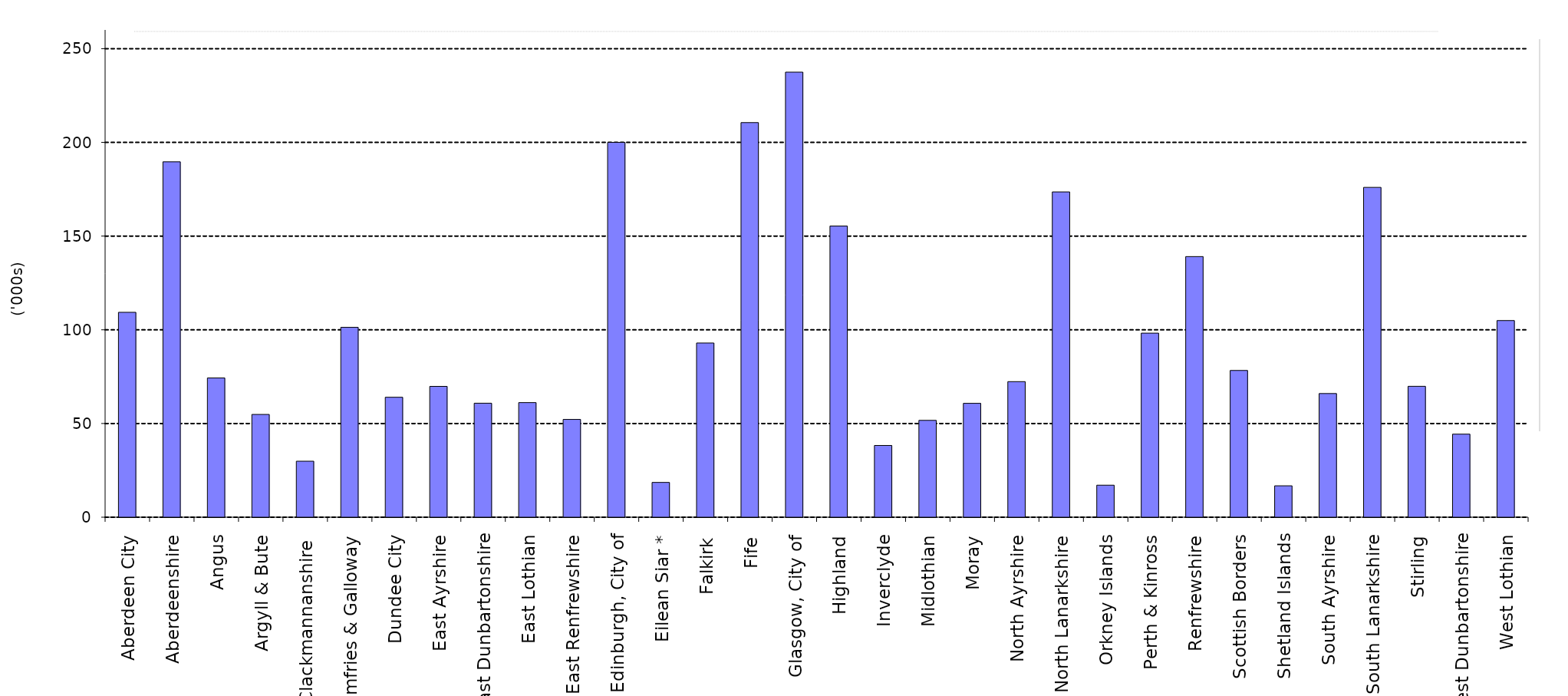
| Category | Series 0 |
|---|---|
| Aberdeen City | 109.334 |
| Aberdeenshire | 189.635 |
| Angus | 74.302 |
| Argyll & Bute | 54.837 |
| Clackmannanshire  | 29.883 |
| Dumfries & Galloway | 101.316 |
| Dundee City | 64.005 |
| East Ayrshire | 69.811 |
| East Dunbartonshire | 60.834 |
| East Lothian | 61.16 |
| East Renfrewshire | 52.177 |
| Edinburgh, City of | 199.993 |
| Eilean Siar * | 18.561 |
| Falkirk | 92.952 |
| Fife | 210.554 |
| Glasgow, City of | 237.478 |
| Highland | 155.36 |
| Inverclyde | 38.285 |
| Midlothian | 51.678 |
| Moray | 60.763 |
| North Ayrshire | 72.345 |
| North Lanarkshire | 173.568 |
| Orkney Islands | 17.094 |
| Perth & Kinross | 98.221 |
| Renfrewshire | 139.066 |
| Scottish Borders | 78.306 |
| Shetland Islands | 16.759 |
| South Ayrshire | 65.991 |
| South Lanarkshire | 175.993 |
| Stirling | 69.852 |
| West Dunbartonshire | 44.321 |
| West Lothian | 104.934 |